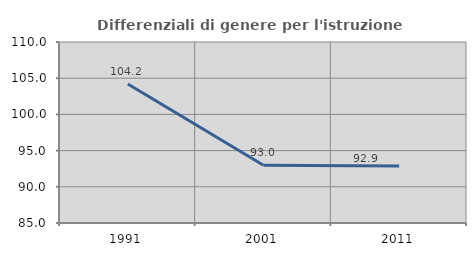
| Category | Differenziali di genere per l'istruzione superiore |
|---|---|
| 1991.0 | 104.207 |
| 2001.0 | 92.966 |
| 2011.0 | 92.88 |